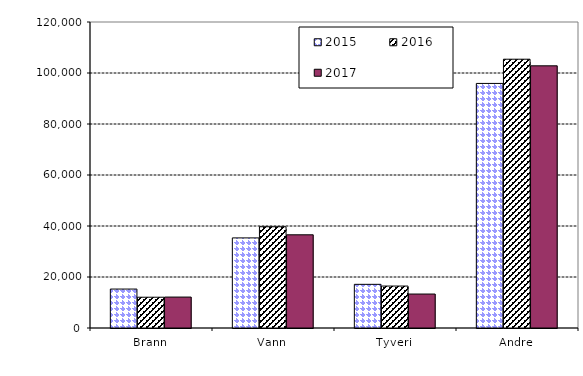
| Category | 2015 | 2016 | 2017 |
|---|---|---|---|
| Brann | 15270.717 | 12067.935 | 12131.619 |
| Vann | 35333.95 | 39707.453 | 36546.509 |
| Tyveri | 17123.305 | 16448.436 | 13316.301 |
| Andre | 95912.214 | 105404.836 | 102813.999 |